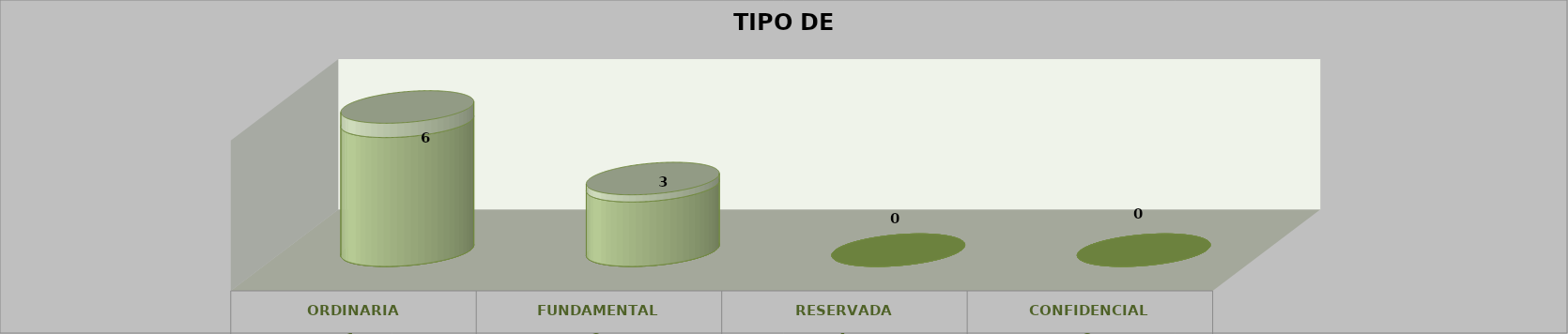
| Category | Series 0 | Series 2 | Series 1 | Series 3 | Series 4 |
|---|---|---|---|---|---|
| 0 |  |  |  | 6 | 0.667 |
| 1 |  |  |  | 3 | 0.333 |
| 2 |  |  |  | 0 | 0 |
| 3 |  |  |  | 0 | 0 |